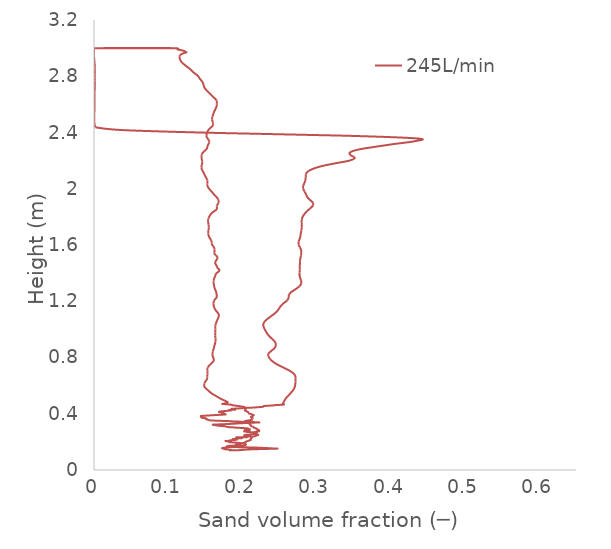
| Category | 245L/min |
|---|---|
| 0.182475 | 0.14 |
| 0.184785 | 0.144 |
| 0.18052 | 0.145 |
| 0.178667 | 0.146 |
| 0.177101 | 0.148 |
| 0.176493 | 0.148 |
| 0.175312 | 0.15 |
| 0.172698 | 0.155 |
| 0.177815 | 0.16 |
| 0.179399 | 0.161 |
| 0.183006 | 0.163 |
| 0.188924 | 0.165 |
| 0.188722 | 0.165 |
| 0.199332 | 0.171 |
| 0.201944 | 0.172 |
| 0.203317 | 0.176 |
| 0.204438 | 0.179 |
| 0.204609 | 0.181 |
| 0.20488 | 0.181 |
| 0.204815 | 0.181 |
| 0.205045 | 0.182 |
| 0.204649 | 0.182 |
| 0.204745 | 0.183 |
| 0.203978 | 0.185 |
| 0.200796 | 0.192 |
| 0.20256 | 0.194 |
| 0.20501 | 0.2 |
| 0.205019 | 0.201 |
| 0.20504 | 0.201 |
| 0.204905 | 0.201 |
| 0.20502 | 0.202 |
| 0.205162 | 0.202 |
| 0.210919 | 0.213 |
| 0.211052 | 0.213 |
| 0.210908 | 0.214 |
| 0.21073 | 0.214 |
| 0.210473 | 0.215 |
| 0.211892 | 0.224 |
| 0.212174 | 0.225 |
| 0.212229 | 0.225 |
| 0.212316 | 0.226 |
| 0.21221 | 0.227 |
| 0.211808 | 0.229 |
| 0.211687 | 0.23 |
| 0.213811 | 0.237 |
| 0.216444 | 0.239 |
| 0.217532 | 0.242 |
| 0.22141 | 0.249 |
| 0.221158 | 0.25 |
| 0.22018 | 0.25 |
| 0.219172 | 0.251 |
| 0.219147 | 0.251 |
| 0.219523 | 0.252 |
| 0.21948 | 0.252 |
| 0.219462 | 0.252 |
| 0.217722 | 0.259 |
| 0.21792 | 0.259 |
| 0.215688 | 0.265 |
| 0.215526 | 0.265 |
| 0.214732 | 0.266 |
| 0.215012 | 0.266 |
| 0.219807 | 0.273 |
| 0.221485 | 0.274 |
| 0.221497 | 0.274 |
| 0.221626 | 0.275 |
| 0.2223 | 0.275 |
| 0.222312 | 0.275 |
| 0.222952 | 0.279 |
| 0.222297 | 0.284 |
| 0.221157 | 0.285 |
| 0.220244 | 0.286 |
| 0.221052 | 0.286 |
| 0.219441 | 0.293 |
| 0.217898 | 0.296 |
| 0.217852 | 0.296 |
| 0.217771 | 0.296 |
| 0.217435 | 0.297 |
| 0.217281 | 0.298 |
| 0.21709 | 0.298 |
| 0.215635 | 0.302 |
| 0.215001 | 0.307 |
| 0.214887 | 0.308 |
| 0.214447 | 0.308 |
| 0.214366 | 0.308 |
| 0.213721 | 0.309 |
| 0.212149 | 0.311 |
| 0.21193 | 0.311 |
| 0.211865 | 0.312 |
| 0.211293 | 0.321 |
| 0.210457 | 0.322 |
| 0.210432 | 0.323 |
| 0.209599 | 0.329 |
| 0.209519 | 0.33 |
| 0.209135 | 0.331 |
| 0.20882 | 0.332 |
| 0.208574 | 0.333 |
| 0.208967 | 0.333 |
| 0.209086 | 0.333 |
| 0.211864 | 0.341 |
| 0.211397 | 0.342 |
| 0.210048 | 0.343 |
| 0.208313 | 0.345 |
| 0.204377 | 0.348 |
| 0.204352 | 0.348 |
| 0.204233 | 0.348 |
| 0.204227 | 0.348 |
| 0.205214 | 0.35 |
| 0.206791 | 0.351 |
| 0.210546 | 0.355 |
| 0.210722 | 0.355 |
| 0.213477 | 0.359 |
| 0.213813 | 0.36 |
| 0.213814 | 0.36 |
| 0.213697 | 0.361 |
| 0.21317 | 0.362 |
| 0.213274 | 0.363 |
| 0.21404 | 0.37 |
| 0.213165 | 0.371 |
| 0.212166 | 0.372 |
| 0.211963 | 0.374 |
| 0.21156 | 0.379 |
| 0.212476 | 0.38 |
| 0.212825 | 0.381 |
| 0.215339 | 0.388 |
| 0.215356 | 0.388 |
| 0.215534 | 0.389 |
| 0.215557 | 0.389 |
| 0.215399 | 0.39 |
| 0.214691 | 0.392 |
| 0.213741 | 0.394 |
| 0.211345 | 0.398 |
| 0.209677 | 0.401 |
| 0.209496 | 0.401 |
| 0.209355 | 0.401 |
| 0.20766 | 0.411 |
| 0.207328 | 0.412 |
| 0.207204 | 0.412 |
| 0.207539 | 0.413 |
| 0.207564 | 0.413 |
| 0.207481 | 0.413 |
| 0.205469 | 0.418 |
| 0.203273 | 0.423 |
| 0.203419 | 0.424 |
| 0.203767 | 0.424 |
| 0.203479 | 0.425 |
| 0.20448 | 0.433 |
| 0.204924 | 0.436 |
| 0.204909 | 0.437 |
| 0.20505 | 0.437 |
| 0.204066 | 0.442 |
| 0.202258 | 0.447 |
| 0.202221 | 0.447 |
| 0.202293 | 0.447 |
| 0.202385 | 0.448 |
| 0.202707 | 0.448 |
| 0.202811 | 0.448 |
| 0.202016 | 0.449 |
| 0.200753 | 0.45 |
| 0.193478 | 0.456 |
| 0.192634 | 0.457 |
| 0.191841 | 0.457 |
| 0.187346 | 0.46 |
| 0.184417 | 0.465 |
| 0.18435 | 0.465 |
| 0.173816 | 0.47 |
| 0.173711 | 0.47 |
| 0.173554 | 0.47 |
| 0.173498 | 0.47 |
| 0.180134 | 0.48 |
| 0.177274 | 0.491 |
| 0.172995 | 0.501 |
| 0.169171 | 0.511 |
| 0.165936 | 0.522 |
| 0.162594 | 0.532 |
| 0.159305 | 0.542 |
| 0.156666 | 0.553 |
| 0.154543 | 0.563 |
| 0.15233 | 0.574 |
| 0.150121 | 0.584 |
| 0.148781 | 0.594 |
| 0.148508 | 0.605 |
| 0.148834 | 0.615 |
| 0.149657 | 0.625 |
| 0.151032 | 0.636 |
| 0.152307 | 0.646 |
| 0.152802 | 0.656 |
| 0.152752 | 0.667 |
| 0.152901 | 0.677 |
| 0.15312 | 0.687 |
| 0.153015 | 0.698 |
| 0.152851 | 0.708 |
| 0.152792 | 0.718 |
| 0.153329 | 0.729 |
| 0.154814 | 0.739 |
| 0.156673 | 0.75 |
| 0.158556 | 0.76 |
| 0.160531 | 0.77 |
| 0.16166 | 0.781 |
| 0.161351 | 0.791 |
| 0.16055 | 0.801 |
| 0.160025 | 0.812 |
| 0.159827 | 0.822 |
| 0.159868 | 0.832 |
| 0.160202 | 0.843 |
| 0.160793 | 0.853 |
| 0.161411 | 0.863 |
| 0.161916 | 0.874 |
| 0.162391 | 0.884 |
| 0.162924 | 0.894 |
| 0.163495 | 0.905 |
| 0.163944 | 0.915 |
| 0.164056 | 0.926 |
| 0.163857 | 0.936 |
| 0.163632 | 0.946 |
| 0.163586 | 0.957 |
| 0.163629 | 0.967 |
| 0.163602 | 0.977 |
| 0.163617 | 0.988 |
| 0.163709 | 0.998 |
| 0.163647 | 1.008 |
| 0.163494 | 1.019 |
| 0.163598 | 1.029 |
| 0.164091 | 1.039 |
| 0.164877 | 1.05 |
| 0.16575 | 1.06 |
| 0.166574 | 1.07 |
| 0.167411 | 1.081 |
| 0.168161 | 1.091 |
| 0.168418 | 1.102 |
| 0.16778 | 1.112 |
| 0.166285 | 1.122 |
| 0.164613 | 1.133 |
| 0.163308 | 1.143 |
| 0.162293 | 1.153 |
| 0.161573 | 1.164 |
| 0.161299 | 1.174 |
| 0.161232 | 1.184 |
| 0.161293 | 1.195 |
| 0.161978 | 1.205 |
| 0.163549 | 1.215 |
| 0.165131 | 1.226 |
| 0.165658 | 1.236 |
| 0.165394 | 1.246 |
| 0.165089 | 1.257 |
| 0.164656 | 1.267 |
| 0.163866 | 1.278 |
| 0.163012 | 1.288 |
| 0.162405 | 1.298 |
| 0.161974 | 1.309 |
| 0.16157 | 1.319 |
| 0.161306 | 1.329 |
| 0.161263 | 1.34 |
| 0.161426 | 1.35 |
| 0.161922 | 1.36 |
| 0.162767 | 1.371 |
| 0.163607 | 1.381 |
| 0.164159 | 1.391 |
| 0.165615 | 1.402 |
| 0.168268 | 1.412 |
| 0.169145 | 1.422 |
| 0.167353 | 1.433 |
| 0.165985 | 1.443 |
| 0.165227 | 1.454 |
| 0.164013 | 1.464 |
| 0.16347 | 1.474 |
| 0.164005 | 1.485 |
| 0.165387 | 1.495 |
| 0.166711 | 1.505 |
| 0.166556 | 1.516 |
| 0.16447 | 1.526 |
| 0.162606 | 1.536 |
| 0.162297 | 1.547 |
| 0.162483 | 1.557 |
| 0.162653 | 1.567 |
| 0.162383 | 1.578 |
| 0.161156 | 1.588 |
| 0.159584 | 1.598 |
| 0.158813 | 1.609 |
| 0.158742 | 1.619 |
| 0.158367 | 1.63 |
| 0.157264 | 1.64 |
| 0.155969 | 1.65 |
| 0.155038 | 1.661 |
| 0.154386 | 1.671 |
| 0.154047 | 1.681 |
| 0.154049 | 1.692 |
| 0.154293 | 1.702 |
| 0.15464 | 1.713 |
| 0.154847 | 1.724 |
| 0.154783 | 1.736 |
| 0.154465 | 1.748 |
| 0.15406 | 1.759 |
| 0.153757 | 1.769 |
| 0.153865 | 1.779 |
| 0.154488 | 1.79 |
| 0.155394 | 1.8 |
| 0.156398 | 1.81 |
| 0.157622 | 1.821 |
| 0.159576 | 1.831 |
| 0.162473 | 1.842 |
| 0.165055 | 1.852 |
| 0.165875 | 1.862 |
| 0.165515 | 1.873 |
| 0.165795 | 1.883 |
| 0.167208 | 1.893 |
| 0.168287 | 1.904 |
| 0.16817 | 1.914 |
| 0.167383 | 1.924 |
| 0.166163 | 1.935 |
| 0.16446 | 1.945 |
| 0.162528 | 1.955 |
| 0.160763 | 1.966 |
| 0.159163 | 1.976 |
| 0.157474 | 1.986 |
| 0.155759 | 1.997 |
| 0.154267 | 2.007 |
| 0.153221 | 2.018 |
| 0.152763 | 2.028 |
| 0.152827 | 2.038 |
| 0.153039 | 2.049 |
| 0.152914 | 2.059 |
| 0.152228 | 2.069 |
| 0.151155 | 2.08 |
| 0.150018 | 2.09 |
| 0.149028 | 2.1 |
| 0.148171 | 2.111 |
| 0.147185 | 2.121 |
| 0.146048 | 2.131 |
| 0.145206 | 2.142 |
| 0.1449 | 2.152 |
| 0.145038 | 2.162 |
| 0.145568 | 2.173 |
| 0.146045 | 2.183 |
| 0.145985 | 2.194 |
| 0.145588 | 2.204 |
| 0.145215 | 2.214 |
| 0.144976 | 2.225 |
| 0.144934 | 2.235 |
| 0.145402 | 2.245 |
| 0.146704 | 2.256 |
| 0.148545 | 2.266 |
| 0.150633 | 2.276 |
| 0.152237 | 2.287 |
| 0.152851 | 2.297 |
| 0.153343 | 2.307 |
| 0.154332 | 2.318 |
| 0.155404 | 2.328 |
| 0.155512 | 2.338 |
| 0.154469 | 2.349 |
| 0.152977 | 2.359 |
| 0.151837 | 2.37 |
| 0.151579 | 2.38 |
| 0.151955 | 2.39 |
| 0.152567 | 2.401 |
| 0.153464 | 2.411 |
| 0.154822 | 2.421 |
| 0.156746 | 2.432 |
| 0.159037 | 2.442 |
| 0.160562 | 2.452 |
| 0.160653 | 2.463 |
| 0.16011 | 2.473 |
| 0.159584 | 2.483 |
| 0.159239 | 2.494 |
| 0.159282 | 2.504 |
| 0.159775 | 2.514 |
| 0.160504 | 2.525 |
| 0.161137 | 2.535 |
| 0.161791 | 2.546 |
| 0.162748 | 2.556 |
| 0.16369 | 2.566 |
| 0.164609 | 2.577 |
| 0.165345 | 2.587 |
| 0.16551 | 2.597 |
| 0.165592 | 2.608 |
| 0.165835 | 2.618 |
| 0.16537 | 2.628 |
| 0.16366 | 2.639 |
| 0.16148 | 2.649 |
| 0.159517 | 2.659 |
| 0.15761 | 2.67 |
| 0.155547 | 2.68 |
| 0.153525 | 2.69 |
| 0.151628 | 2.701 |
| 0.149951 | 2.711 |
| 0.148729 | 2.722 |
| 0.148011 | 2.732 |
| 0.147533 | 2.742 |
| 0.146859 | 2.753 |
| 0.145737 | 2.763 |
| 0.144167 | 2.773 |
| 0.142501 | 2.784 |
| 0.141349 | 2.794 |
| 0.139886 | 2.804 |
| 0.137274 | 2.815 |
| 0.13467 | 2.825 |
| 0.132634 | 2.835 |
| 0.130664 | 2.846 |
| 0.128392 | 2.856 |
| 0.125812 | 2.866 |
| 0.123214 | 2.877 |
| 0.120813 | 2.887 |
| 0.118746 | 2.898 |
| 0.117157 | 2.908 |
| 0.116129 | 2.918 |
| 0.115573 | 2.929 |
| 0.115306 | 2.939 |
| 0.115676 | 2.949 |
| 0.118778 | 2.96 |
| 0.1242 | 2.97 |
| 0.1242 | 2.97 |
| 0.12163 | 2.98 |
| 0.11315 | 2.99 |
| 0.103653 | 3 |
| 0.0128369 | 3 |
| 0.0134312 | 3 |
| 0.017917 | 3 |
| 0.0225617 | 3 |
| 0.0275804 | 3 |
| 0.0380575 | 3 |
| 0.0408998 | 3 |
| 0.0551879 | 3 |
| 0.0738402 | 3 |
| 0.0985651 | 3 |
| 0.103634 | 3 |
| 0.103655 | 3 |
| 0.000453932 | 3 |
| 0.000164467 | 3 |
| 8.98488e-05 | 3 |
| 6.08998e-05 | 3 |
| 6.17102e-05 | 3 |
| 0.0 | 3 |
| 0.0 | 3 |
| 0.0 | 3 |
| 0.0 | 3 |
| 0.0 | 3 |
| 0.0 | 3 |
| 0.0 | 3 |
| 0.0 | 2.997 |
| 0.0 | 2.988 |
| 0.0 | 2.978 |
| 0.0 | 2.969 |
| 3.41637e-17 | 2.959 |
| 1.92617e-05 | 2.95 |
| 8.39302e-05 | 2.94 |
| 0.000193562 | 2.93 |
| 0.000337496 | 2.92 |
| 0.000497848 | 2.91 |
| 0.000657682 | 2.9 |
| 0.000804327 | 2.89 |
| 0.000929996 | 2.88 |
| 0.00103141 | 2.87 |
| 0.00110048 | 2.86 |
| 0.00114575 | 2.85 |
| 0.0011889 | 2.83 |
| 0.0011773 | 2.811 |
| 0.00113773 | 2.791 |
| 0.00108209 | 2.771 |
| 0.00101865 | 2.752 |
| 0.000952024 | 2.732 |
| 0.000886067 | 2.712 |
| 0.000824059 | 2.692 |
| 0.000767509 | 2.673 |
| 0.000716668 | 2.653 |
| 0.000670999 | 2.633 |
| 0.000629666 | 2.614 |
| 0.000591901 | 2.594 |
| 0.000557061 | 2.574 |
| 0.000524904 | 2.555 |
| 0.000496174 | 2.535 |
| 0.000472616 | 2.515 |
| 0.000458178 | 2.495 |
| 0.000459768 | 2.476 |
| 0.000566566 | 2.456 |
| 0.00211738 | 2.436 |
| 0.0403099 | 2.417 |
| 0.164708 | 2.397 |
| 0.33847 | 2.377 |
| 0.436318 | 2.358 |
| 0.432415 | 2.338 |
| 0.404636 | 2.318 |
| 0.379315 | 2.298 |
| 0.356601 | 2.279 |
| 0.345354 | 2.259 |
| 0.345979 | 2.239 |
| 0.351751 | 2.22 |
| 0.344345 | 2.2 |
| 0.324483 | 2.18 |
| 0.306459 | 2.16 |
| 0.294584 | 2.14 |
| 0.287828 | 2.12 |
| 0.285553 | 2.101 |
| 0.285443 | 2.081 |
| 0.285197 | 2.061 |
| 0.283746 | 2.041 |
| 0.282065 | 2.021 |
| 0.281942 | 2.001 |
| 0.283719 | 1.981 |
| 0.285877 | 1.961 |
| 0.287603 | 1.941 |
| 0.291066 | 1.922 |
| 0.295386 | 1.902 |
| 0.295673 | 1.882 |
| 0.291928 | 1.862 |
| 0.287604 | 1.842 |
| 0.284093 | 1.822 |
| 0.281538 | 1.802 |
| 0.280163 | 1.782 |
| 0.279925 | 1.763 |
| 0.280231 | 1.743 |
| 0.280227 | 1.723 |
| 0.2796 | 1.703 |
| 0.278851 | 1.683 |
| 0.278352 | 1.663 |
| 0.277352 | 1.643 |
| 0.275793 | 1.623 |
| 0.275756 | 1.603 |
| 0.277665 | 1.584 |
| 0.279335 | 1.564 |
| 0.279669 | 1.544 |
| 0.279055 | 1.524 |
| 0.278253 | 1.504 |
| 0.277822 | 1.484 |
| 0.277664 | 1.464 |
| 0.277508 | 1.444 |
| 0.277434 | 1.424 |
| 0.277237 | 1.405 |
| 0.277218 | 1.385 |
| 0.277218 | 1.385 |
| 0.278115 | 1.365 |
| 0.27949 | 1.345 |
| 0.279624 | 1.325 |
| 0.27698 | 1.305 |
| 0.271716 | 1.285 |
| 0.266046 | 1.265 |
| 0.26271 | 1.246 |
| 0.262626 | 1.226 |
| 0.26068 | 1.206 |
| 0.255696 | 1.186 |
| 0.251867 | 1.166 |
| 0.249332 | 1.146 |
| 0.246459 | 1.126 |
| 0.24199 | 1.106 |
| 0.23694 | 1.086 |
| 0.232161 | 1.067 |
| 0.228944 | 1.047 |
| 0.228349 | 1.027 |
| 0.229621 | 1.007 |
| 0.23161 | 0.987 |
| 0.233956 | 0.967 |
| 0.237192 | 0.947 |
| 0.241177 | 0.927 |
| 0.244493 | 0.907 |
| 0.245198 | 0.888 |
| 0.243694 | 0.868 |
| 0.23933 | 0.848 |
| 0.234969 | 0.828 |
| 0.234958 | 0.808 |
| 0.237597 | 0.788 |
| 0.241752 | 0.768 |
| 0.247766 | 0.748 |
| 0.255321 | 0.729 |
| 0.262904 | 0.709 |
| 0.268677 | 0.689 |
| 0.271424 | 0.669 |
| 0.271909 | 0.649 |
| 0.271735 | 0.629 |
| 0.271397 | 0.609 |
| 0.27063 | 0.589 |
| 0.268762 | 0.569 |
| 0.265605 | 0.55 |
| 0.262274 | 0.53 |
| 0.258697 | 0.51 |
| 0.256521 | 0.49 |
| 0.254369 | 0.47 |
| 0.254455 | 0.47 |
| 0.254709 | 0.47 |
| 0.255888 | 0.469 |
| 0.255642 | 0.469 |
| 0.255999 | 0.469 |
| 0.255879 | 0.468 |
| 0.254996 | 0.467 |
| 0.254395 | 0.467 |
| 0.254387 | 0.467 |
| 0.254365 | 0.467 |
| 0.256053 | 0.466 |
| 0.256061 | 0.466 |
| 0.255595 | 0.465 |
| 0.255253 | 0.465 |
| 0.252979 | 0.464 |
| 0.246138 | 0.462 |
| 0.243836 | 0.461 |
| 0.242277 | 0.46 |
| 0.242145 | 0.46 |
| 0.241585 | 0.459 |
| 0.239856 | 0.459 |
| 0.234539 | 0.457 |
| 0.233274 | 0.457 |
| 0.233226 | 0.457 |
| 0.23305 | 0.457 |
| 0.228676 | 0.455 |
| 0.228542 | 0.451 |
| 0.226535 | 0.449 |
| 0.225909 | 0.448 |
| 0.224229 | 0.448 |
| 0.21724 | 0.445 |
| 0.212568 | 0.443 |
| 0.207694 | 0.442 |
| 0.205774 | 0.442 |
| 0.202199 | 0.441 |
| 0.201561 | 0.44 |
| 0.20058 | 0.44 |
| 0.186877 | 0.435 |
| 0.185639 | 0.435 |
| 0.189371 | 0.43 |
| 0.189772 | 0.429 |
| 0.189904 | 0.429 |
| 0.190171 | 0.429 |
| 0.184406 | 0.428 |
| 0.18439 | 0.427 |
| 0.182102 | 0.427 |
| 0.182704 | 0.426 |
| 0.18423 | 0.423 |
| 0.171211 | 0.417 |
| 0.170253 | 0.416 |
| 0.169657 | 0.415 |
| 0.169362 | 0.414 |
| 0.168415 | 0.413 |
| 0.171382 | 0.41 |
| 0.171885 | 0.409 |
| 0.173109 | 0.406 |
| 0.173397 | 0.406 |
| 0.173077 | 0.405 |
| 0.173449 | 0.405 |
| 0.173465 | 0.405 |
| 0.173689 | 0.405 |
| 0.173748 | 0.405 |
| 0.174334 | 0.404 |
| 0.176388 | 0.401 |
| 0.17718 | 0.396 |
| 0.177079 | 0.395 |
| 0.176256 | 0.395 |
| 0.175133 | 0.394 |
| 0.146275 | 0.385 |
| 0.146439 | 0.385 |
| 0.146616 | 0.384 |
| 0.144326 | 0.382 |
| 0.144234 | 0.38 |
| 0.144079 | 0.377 |
| 0.145611 | 0.374 |
| 0.145927 | 0.373 |
| 0.145344 | 0.371 |
| 0.149442 | 0.369 |
| 0.151772 | 0.366 |
| 0.151412 | 0.365 |
| 0.150951 | 0.364 |
| 0.150584 | 0.363 |
| 0.152907 | 0.358 |
| 0.154144 | 0.357 |
| 0.155155 | 0.355 |
| 0.155827 | 0.353 |
| 0.162404 | 0.351 |
| 0.164737 | 0.351 |
| 0.18009 | 0.348 |
| 0.182047 | 0.347 |
| 0.185503 | 0.346 |
| 0.203457 | 0.343 |
| 0.205985 | 0.342 |
| 0.207465 | 0.342 |
| 0.214448 | 0.341 |
| 0.218941 | 0.34 |
| 0.218941 | 0.34 |
| 0.223092 | 0.338 |
| 0.217019 | 0.337 |
| 0.21545 | 0.337 |
| 0.208321 | 0.335 |
| 0.206999 | 0.334 |
| 0.206418 | 0.334 |
| 0.198385 | 0.333 |
| 0.18946 | 0.329 |
| 0.188149 | 0.329 |
| 0.181105 | 0.327 |
| 0.172548 | 0.325 |
| 0.168747 | 0.325 |
| 0.160699 | 0.323 |
| 0.160414 | 0.322 |
| 0.160277 | 0.321 |
| 0.161572 | 0.32 |
| 0.163625 | 0.318 |
| 0.166235 | 0.316 |
| 0.166948 | 0.315 |
| 0.167445 | 0.315 |
| 0.16942 | 0.314 |
| 0.171353 | 0.313 |
| 0.176794 | 0.311 |
| 0.177699 | 0.309 |
| 0.179342 | 0.307 |
| 0.181864 | 0.305 |
| 0.18206 | 0.304 |
| 0.190727 | 0.302 |
| 0.191327 | 0.301 |
| 0.191381 | 0.301 |
| 0.201169 | 0.298 |
| 0.204369 | 0.297 |
| 0.207169 | 0.296 |
| 0.207832 | 0.294 |
| 0.206207 | 0.291 |
| 0.206178 | 0.291 |
| 0.20623 | 0.291 |
| 0.209592 | 0.29 |
| 0.210012 | 0.29 |
| 0.205986 | 0.287 |
| 0.205247 | 0.287 |
| 0.205163 | 0.286 |
| 0.202948 | 0.284 |
| 0.205116 | 0.282 |
| 0.206023 | 0.282 |
| 0.208203 | 0.28 |
| 0.209942 | 0.278 |
| 0.209174 | 0.278 |
| 0.202648 | 0.274 |
| 0.203947 | 0.274 |
| 0.206042 | 0.272 |
| 0.205868 | 0.271 |
| 0.207074 | 0.27 |
| 0.212572 | 0.268 |
| 0.219565 | 0.266 |
| 0.21811 | 0.262 |
| 0.217646 | 0.261 |
| 0.218636 | 0.261 |
| 0.218205 | 0.261 |
| 0.217627 | 0.26 |
| 0.218274 | 0.259 |
| 0.219172 | 0.258 |
| 0.216771 | 0.256 |
| 0.214641 | 0.254 |
| 0.212005 | 0.252 |
| 0.208279 | 0.251 |
| 0.205174 | 0.251 |
| 0.202466 | 0.247 |
| 0.203286 | 0.246 |
| 0.203812 | 0.245 |
| 0.205458 | 0.242 |
| 0.210824 | 0.24 |
| 0.209149 | 0.239 |
| 0.204213 | 0.237 |
| 0.205218 | 0.235 |
| 0.2061 | 0.234 |
| 0.197761 | 0.233 |
| 0.194979 | 0.233 |
| 0.191476 | 0.232 |
| 0.195056 | 0.228 |
| 0.196217 | 0.227 |
| 0.199693 | 0.226 |
| 0.192216 | 0.224 |
| 0.191998 | 0.223 |
| 0.191482 | 0.221 |
| 0.187128 | 0.22 |
| 0.19217 | 0.216 |
| 0.192009 | 0.216 |
| 0.190845 | 0.215 |
| 0.189653 | 0.214 |
| 0.188451 | 0.213 |
| 0.184438 | 0.211 |
| 0.182012 | 0.209 |
| 0.18148 | 0.208 |
| 0.18204 | 0.207 |
| 0.178448 | 0.206 |
| 0.177348 | 0.206 |
| 0.182138 | 0.202 |
| 0.181826 | 0.201 |
| 0.182519 | 0.198 |
| 0.183769 | 0.198 |
| 0.188285 | 0.195 |
| 0.191382 | 0.195 |
| 0.200792 | 0.19 |
| 0.200902 | 0.19 |
| 0.201693 | 0.189 |
| 0.201857 | 0.189 |
| 0.200932 | 0.189 |
| 0.199251 | 0.188 |
| 0.199865 | 0.188 |
| 0.192745 | 0.183 |
| 0.191899 | 0.181 |
| 0.191694 | 0.18 |
| 0.195074 | 0.178 |
| 0.195074 | 0.178 |
| 0.197662 | 0.177 |
| 0.196311 | 0.177 |
| 0.189227 | 0.174 |
| 0.18187 | 0.171 |
| 0.181636 | 0.171 |
| 0.179172 | 0.168 |
| 0.17908 | 0.168 |
| 0.180523 | 0.166 |
| 0.181474 | 0.165 |
| 0.182352 | 0.165 |
| 0.183306 | 0.165 |
| 0.190022 | 0.163 |
| 0.223992 | 0.159 |
| 0.223999 | 0.158 |
| 0.224445 | 0.158 |
| 0.245354 | 0.153 |
| 0.247156 | 0.152 |
| 0.245183 | 0.152 |
| 0.243689 | 0.151 |
| 0.212523 | 0.147 |
| 0.20665 | 0.145 |
| 0.206496 | 0.145 |
| 0.198955 | 0.143 |
| 0.199389 | 0.142 |
| 0.182475 | 0.14 |